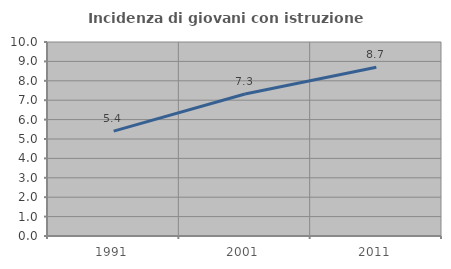
| Category | Incidenza di giovani con istruzione universitaria |
|---|---|
| 1991.0 | 5.405 |
| 2001.0 | 7.317 |
| 2011.0 | 8.696 |